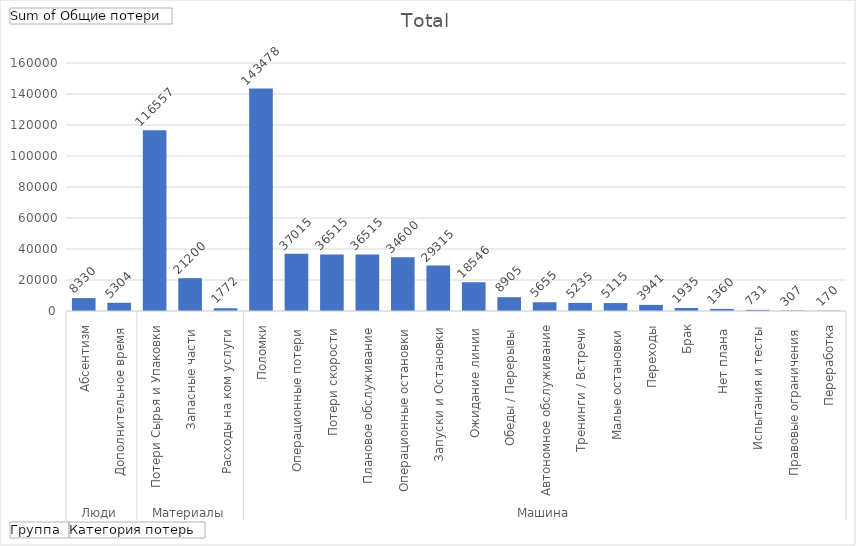
| Category | Total |
|---|---|
| 0 | 8330 |
| 1 | 5304 |
| 2 | 116557.324 |
| 3 | 21200 |
| 4 | 1771.749 |
| 5 | 143478.405 |
| 6 | 37014.888 |
| 7 | 36514.695 |
| 8 | 36514.695 |
| 9 | 34600.173 |
| 10 | 29315.151 |
| 11 | 18546.199 |
| 12 | 8905.236 |
| 13 | 5654.691 |
| 14 | 5235.274 |
| 15 | 5114.831 |
| 16 | 3941.3 |
| 17 | 1934.733 |
| 18 | 1360 |
| 19 | 730.733 |
| 20 | 306.727 |
| 21 | 169.68 |